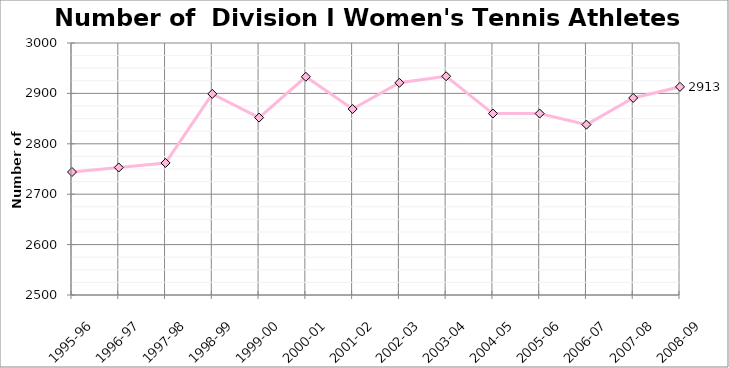
| Category | Women |
|---|---|
| 1995-96 | 2744 |
| 1996-97 | 2753 |
| 1997-98 | 2762 |
| 1998-99 | 2899 |
| 1999-00 | 2852 |
| 2000-01 | 2933 |
| 2001-02 | 2869 |
| 2002-03 | 2921 |
| 2003-04 | 2934 |
| 2004-05 | 2860 |
| 2005-06 | 2860 |
| 2006-07 | 2838 |
| 2007-08 | 2891 |
| 2008-09 | 2913 |